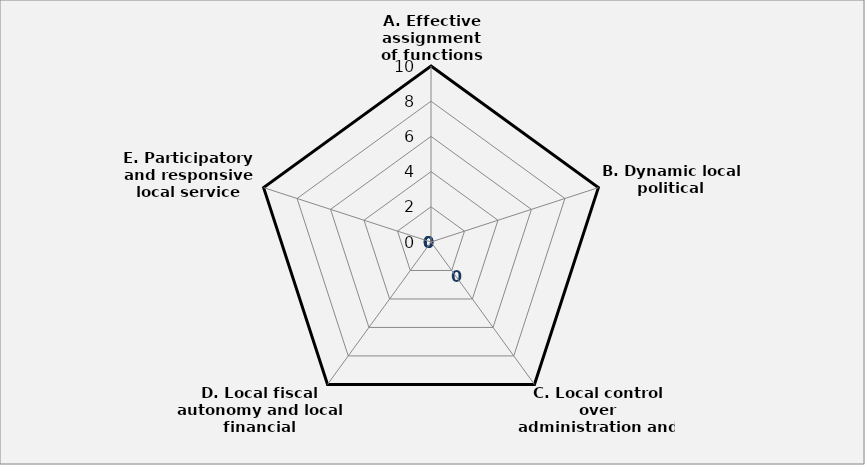
| Category | Score | Maximum |
|---|---|---|
| A. Effective assignment of functions | 0 | 10 |
| B. Dynamic local political leadership | 0 | 10 |
| C. Local control over administration and service delivery | 0 | 10 |
| D. Local fiscal autonomy and local financial management | 0 | 10 |
| E. Participatory and responsive local service delivery | 0 | 10 |